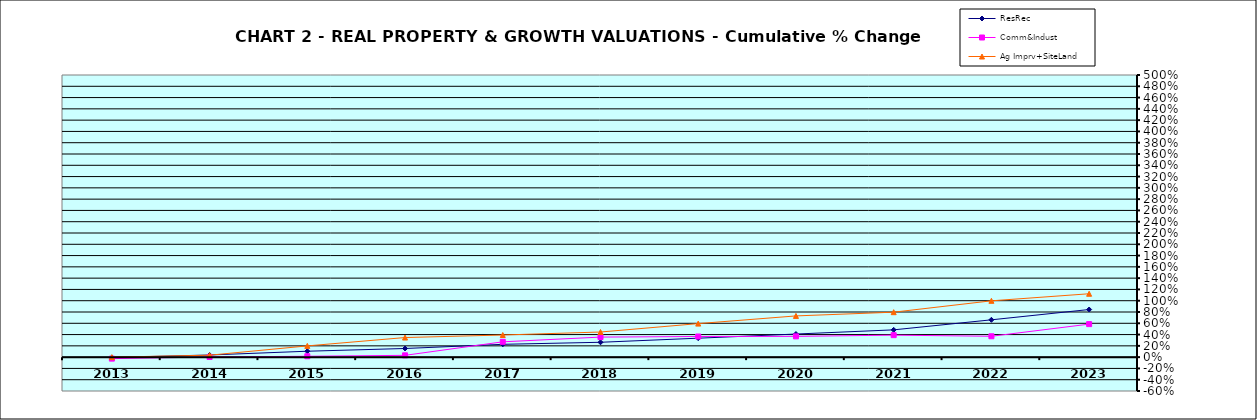
| Category | ResRec | Comm&Indust | Ag Imprv+SiteLand |
|---|---|---|---|
| 2013.0 | -0.006 | -0.026 | 0 |
| 2014.0 | 0.038 | 0.003 | 0.034 |
| 2015.0 | 0.105 | 0.016 | 0.199 |
| 2016.0 | 0.153 | 0.032 | 0.347 |
| 2017.0 | 0.227 | 0.271 | 0.392 |
| 2018.0 | 0.264 | 0.356 | 0.445 |
| 2019.0 | 0.336 | 0.366 | 0.594 |
| 2020.0 | 0.409 | 0.368 | 0.731 |
| 2021.0 | 0.484 | 0.39 | 0.797 |
| 2022.0 | 0.661 | 0.37 | 0.998 |
| 2023.0 | 0.844 | 0.585 | 1.123 |